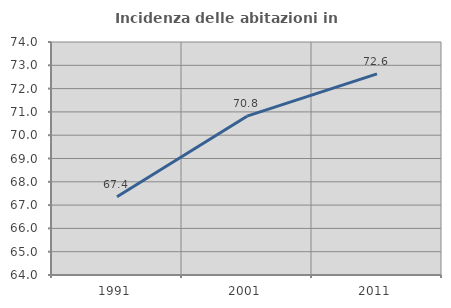
| Category | Incidenza delle abitazioni in proprietà  |
|---|---|
| 1991.0 | 67.357 |
| 2001.0 | 70.817 |
| 2011.0 | 72.632 |